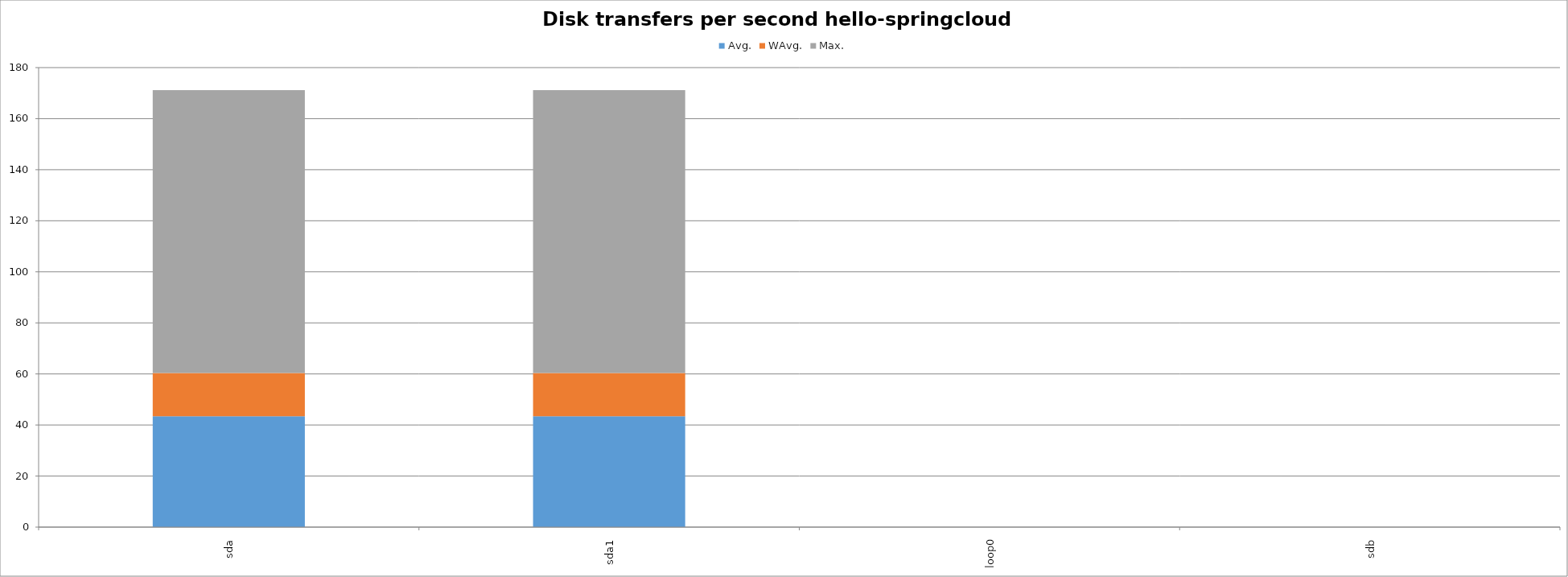
| Category | Avg. | WAvg. | Max. |
|---|---|---|---|
| sda | 43.403 | 16.972 | 110.825 |
| sda1 | 43.403 | 16.972 | 110.825 |
| loop0 | 0 | 0 | 0 |
| sdb | 0 | 0 | 0 |